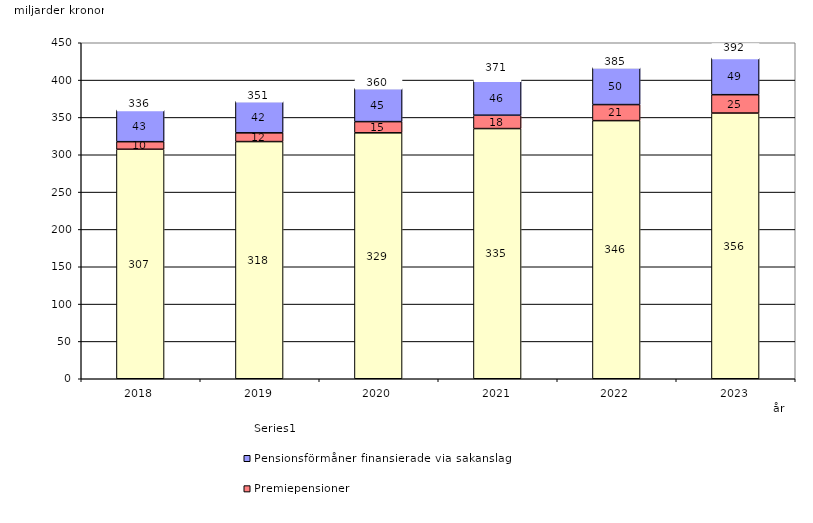
| Category | Inkomstpension och tilläggspension m.m. | Premiepensioner | Pensionsförmåner finansierade via sakanslag | Series 0 |
|---|---|---|---|---|
| 2018.0 | 307.356 | 10.141 | 42.55 | 20 |
| 2019.0 | 317.628 | 11.715 | 42.22 | 20 |
| 2020.0 | 329.365 | 15.016 | 44.546 | 20 |
| 2021.0 | 335.061 | 17.88 | 46.171 | 20 |
| 2022.0 | 345.687 | 21.492 | 49.57 | 20 |
| 2023.0 | 355.845 | 24.601 | 49.282 | 20 |